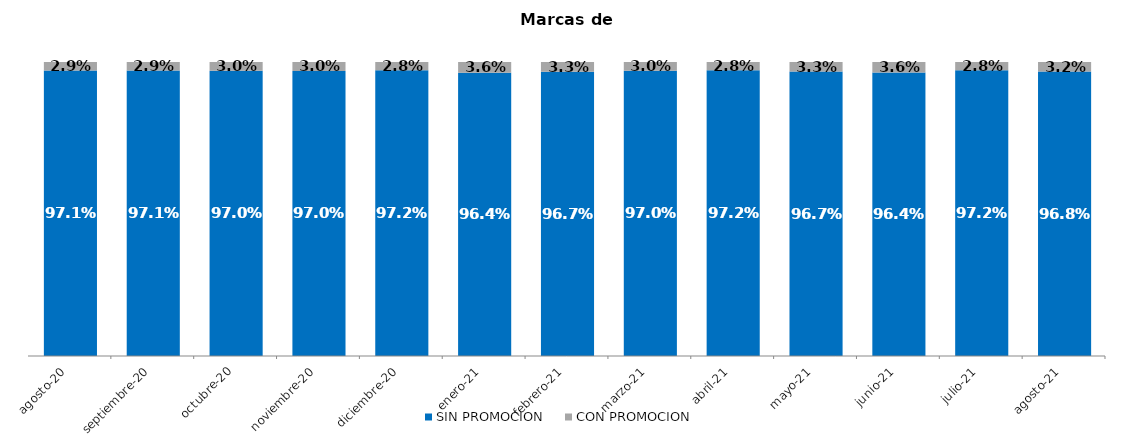
| Category | SIN PROMOCION   | CON PROMOCION   |
|---|---|---|
| 2020-08-01 | 0.971 | 0.029 |
| 2020-09-01 | 0.971 | 0.029 |
| 2020-10-01 | 0.97 | 0.03 |
| 2020-11-01 | 0.97 | 0.03 |
| 2020-12-01 | 0.972 | 0.028 |
| 2021-01-01 | 0.964 | 0.036 |
| 2021-02-01 | 0.967 | 0.033 |
| 2021-03-01 | 0.97 | 0.03 |
| 2021-04-01 | 0.972 | 0.028 |
| 2021-05-01 | 0.967 | 0.033 |
| 2021-06-01 | 0.964 | 0.036 |
| 2021-07-01 | 0.972 | 0.028 |
| 2021-08-01 | 0.968 | 0.032 |